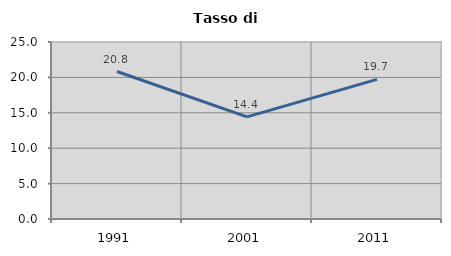
| Category | Tasso di disoccupazione   |
|---|---|
| 1991.0 | 20.833 |
| 2001.0 | 14.423 |
| 2011.0 | 19.718 |